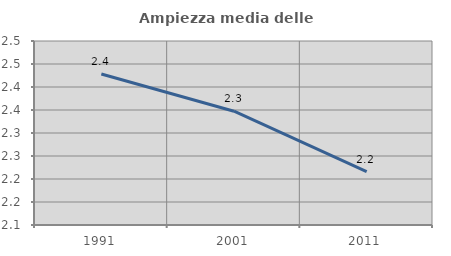
| Category | Ampiezza media delle famiglie |
|---|---|
| 1991.0 | 2.428 |
| 2001.0 | 2.347 |
| 2011.0 | 2.216 |